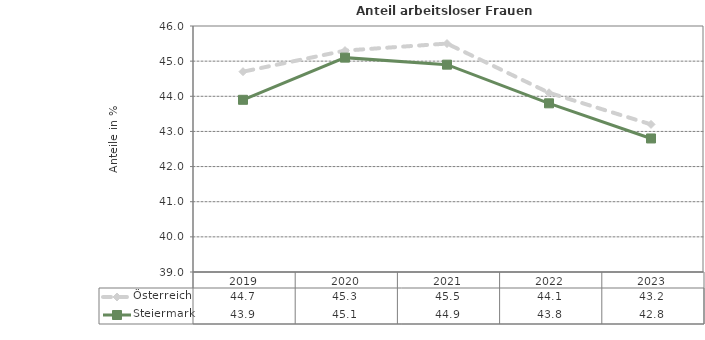
| Category | Österreich | Steiermark |
|---|---|---|
| 2023.0 | 43.2 | 42.8 |
| 2022.0 | 44.1 | 43.8 |
| 2021.0 | 45.5 | 44.9 |
| 2020.0 | 45.3 | 45.1 |
| 2019.0 | 44.7 | 43.9 |